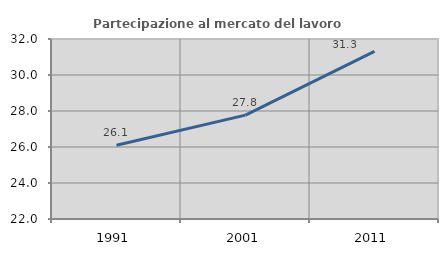
| Category | Partecipazione al mercato del lavoro  femminile |
|---|---|
| 1991.0 | 26.095 |
| 2001.0 | 27.77 |
| 2011.0 | 31.312 |